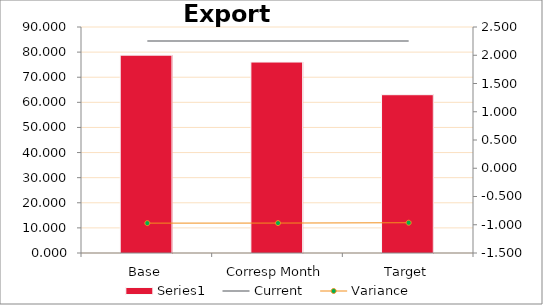
| Category | Series 0 |
|---|---|
| Base | 78.792 |
| Corresp Month | 76.044 |
| Target | 63.034 |